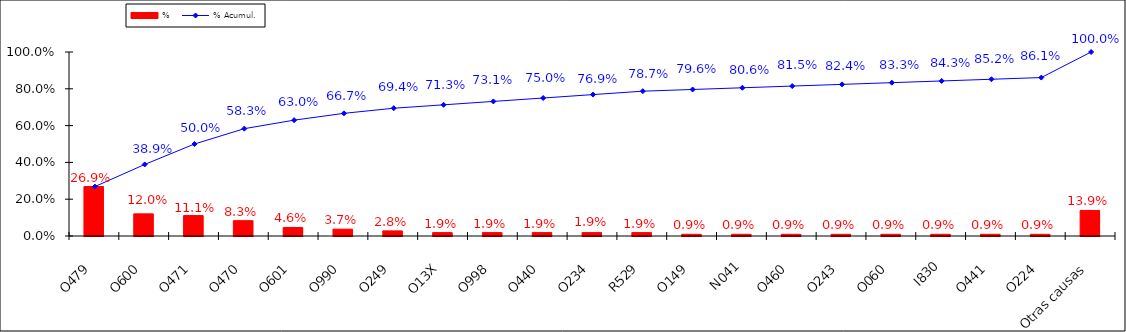
| Category | % |
|---|---|
| O479 | 0.269 |
| O600 | 0.12 |
| O471 | 0.111 |
| O470 | 0.083 |
| O601 | 0.046 |
| O990 | 0.037 |
| O249 | 0.028 |
| O13X | 0.019 |
| O998 | 0.019 |
| O440 | 0.019 |
| O234 | 0.019 |
| R529 | 0.019 |
| O149 | 0.009 |
| N041 | 0.009 |
| O460 | 0.009 |
| O243 | 0.009 |
| O060 | 0.009 |
| I830 | 0.009 |
| O441 | 0.009 |
| O224 | 0.009 |
| Otras causas | 0.139 |